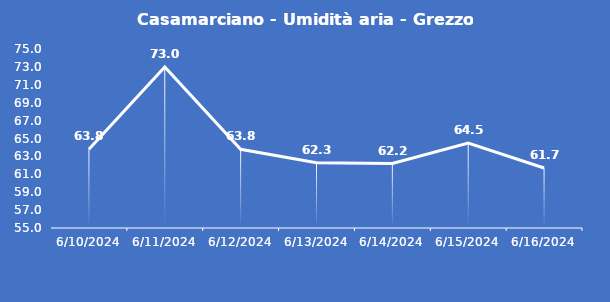
| Category | Casamarciano - Umidità aria - Grezzo (%) |
|---|---|
| 6/10/24 | 63.8 |
| 6/11/24 | 73 |
| 6/12/24 | 63.8 |
| 6/13/24 | 62.3 |
| 6/14/24 | 62.2 |
| 6/15/24 | 64.5 |
| 6/16/24 | 61.7 |